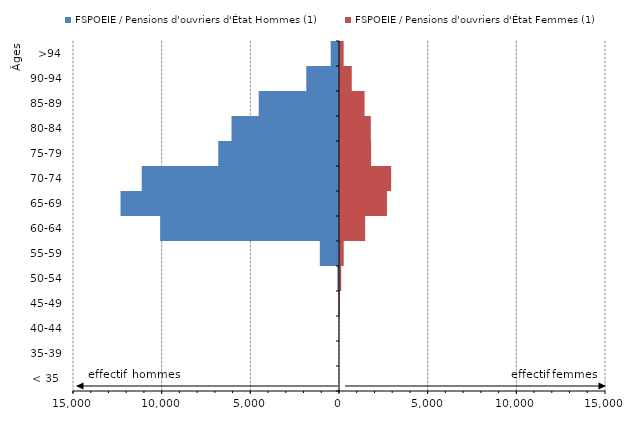
| Category | FSPOEIE / Pensions d'ouvriers d'État Hommes (1) | FSPOEIE / Pensions d'ouvriers d'État Femmes (1) |
|---|---|---|
| < 35  | 0 | 0 |
| 35-39 | -6 | 2 |
| 40-44 | -19 | 6 |
| 45-49 | -37 | 46 |
| 50-54 | -91 | 125 |
| 55-59 | -1082 | 266 |
| 60-64 | -10088 | 1476 |
| 65-69 | -12320 | 2706 |
| 70-74 | -11125 | 2940 |
| 75-79 | -6809 | 1811 |
| 80-84 | -6062 | 1793 |
| 85-89 | -4528 | 1443 |
| 90-94 | -1845 | 721 |
| >94 | -469 | 263 |